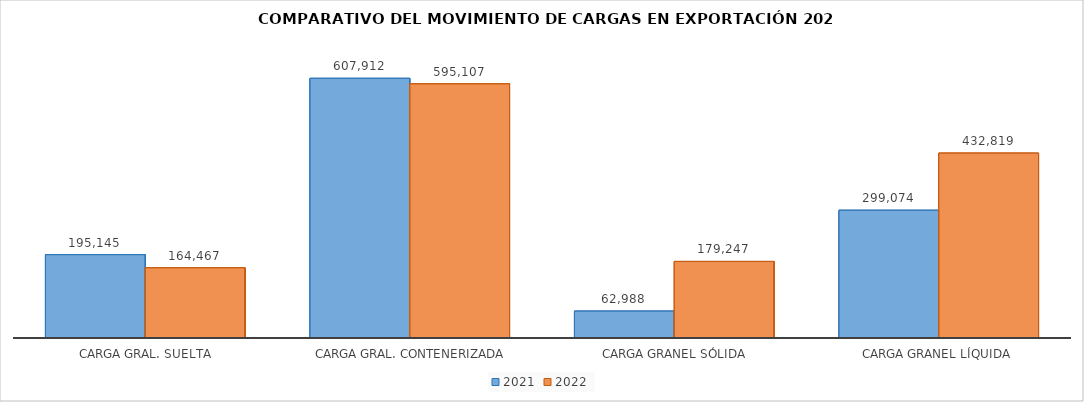
| Category | 2021 | 2022 |
|---|---|---|
|  CARGA GRAL. SUELTA | 195145 | 164467.45 |
|  CARGA GRAL. CONTENERIZADA | 607912 | 595107 |
|  CARGA GRANEL SÓLIDA | 62988 | 179247 |
| CARGA GRANEL LÍQUIDA | 299074 | 432818.63 |